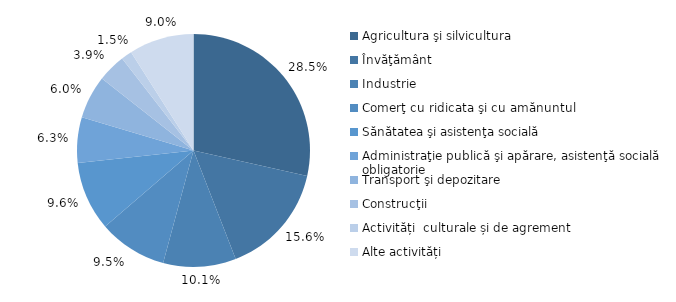
| Category | Series 0 |
|---|---|
| Agricultura şi silvicultura | 0.285 |
| Învăţământ | 0.156 |
| Industrie | 0.101 |
| Comerţ cu ridicata şi cu amănuntul | 0.095 |
| Sănătatea şi asistenţa socială | 0.096 |
| Administraţie publică şi apărare, asistenţă socială obligatorie | 0.063 |
| Transport şi depozitare | 0.06 |
| Construcţii | 0.039 |
| Activități  culturale și de agrement | 0.015 |
| Alte activități | 0.09 |